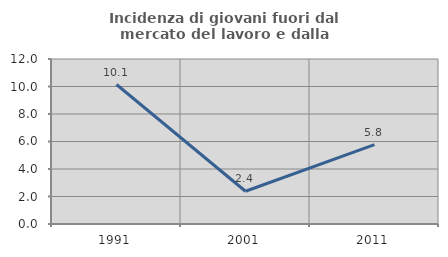
| Category | Incidenza di giovani fuori dal mercato del lavoro e dalla formazione  |
|---|---|
| 1991.0 | 10.145 |
| 2001.0 | 2.381 |
| 2011.0 | 5.769 |